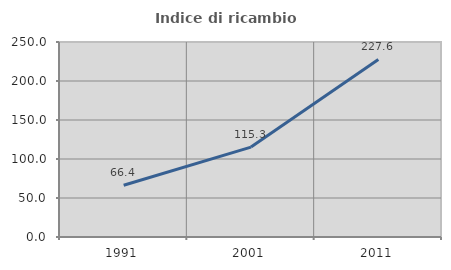
| Category | Indice di ricambio occupazionale  |
|---|---|
| 1991.0 | 66.359 |
| 2001.0 | 115.254 |
| 2011.0 | 227.612 |